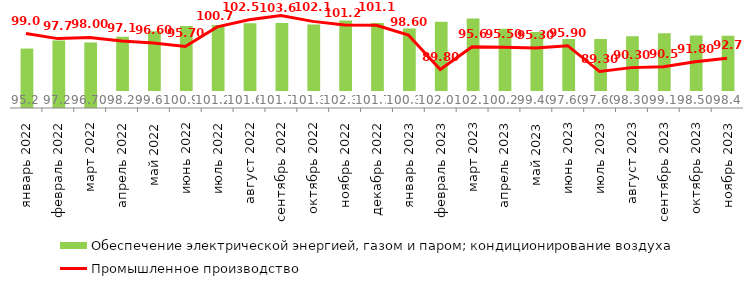
| Category | Обеспечение электрической энергией, газом и паром; кондиционирование воздуха |
|---|---|
| 2022-01-01 | 95.16 |
| 2022-02-01 | 97.2 |
| 2022-03-01 | 96.7 |
| 2022-04-01 | 98.2 |
| 2022-05-01 | 99.6 |
| 2022-06-01 | 100.9 |
| 2022-07-01 | 101.2 |
| 2022-08-01 | 101.6 |
| 2022-09-01 | 101.7 |
| 2022-10-01 | 101.3 |
| 2022-11-01 | 102.3 |
| 2022-12-01 | 101.7 |
| 2023-01-01 | 100.3 |
| 2023-02-01 | 102 |
| 2023-03-01 | 102.8 |
| 2023-04-01 | 100.2 |
| 2023-05-01 | 99.4 |
| 2023-06-01 | 97.6 |
| 2023-07-01 | 97.6 |
| 2023-08-01 | 98.3 |
| 2023-09-01 | 99.1 |
| 2023-10-01 | 98.5 |
| 2023-11-01 | 98.4 |